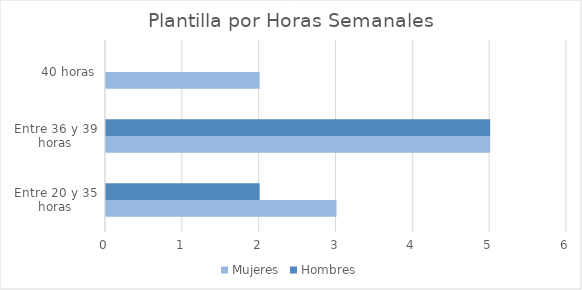
| Category | Mujeres | Hombres |
|---|---|---|
| Entre 20 y 35 horas | 3 | 2 |
| Entre 36 y 39 horas | 5 | 5 |
| 40 horas | 2 | 0 |